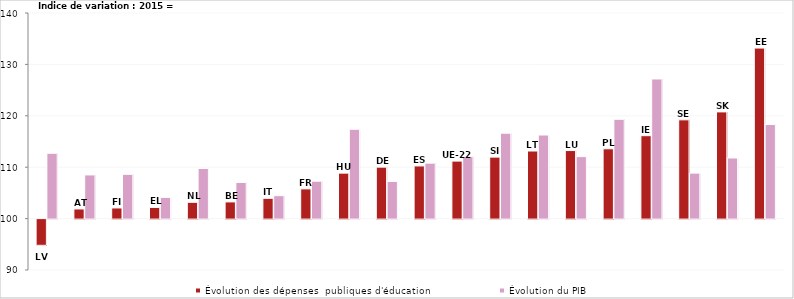
| Category | Évolution des dépenses  publiques d'éducation | Évolution du PIB  |
|---|---|---|
| LV | 94.902 | 112.711 |
| AT | 101.875 | 108.496 |
| FI | 102.07 | 108.615 |
| EL | 102.171 | 104.123 |
| NL | 103.171 | 109.754 |
| BE | 103.247 | 107.031 |
| IT | 103.946 | 104.456 |
| FR | 105.781 | 107.282 |
| HU | 108.846 | 117.378 |
| DE | 110.013 | 107.23 |
| ES | 110.246 | 110.786 |
| UE-22 | 111.19 | 112.043 |
| SI | 111.965 | 116.616 |
| LT | 113.151 | 116.264 |
| LU | 113.239 | 112.056 |
| PL | 113.583 | 119.318 |
| IE | 116.129 | 127.163 |
| SE | 119.214 | 108.853 |
| SK | 120.758 | 111.791 |
| EE | 133.178 | 118.297 |